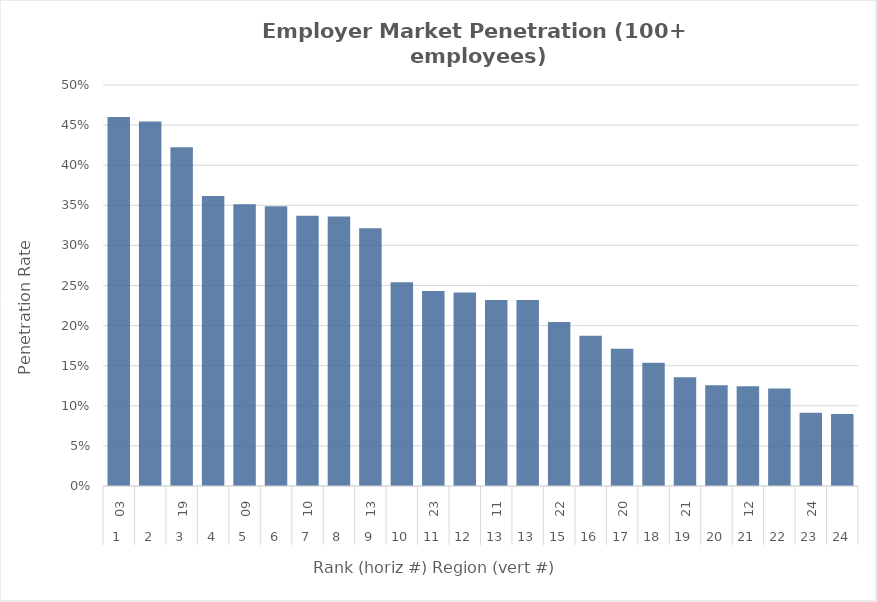
| Category | Rate |
|---|---|
| 0 | 0.46 |
| 1 | 0.455 |
| 2 | 0.423 |
| 3 | 0.362 |
| 4 | 0.351 |
| 5 | 0.349 |
| 6 | 0.337 |
| 7 | 0.336 |
| 8 | 0.321 |
| 9 | 0.254 |
| 10 | 0.243 |
| 11 | 0.241 |
| 12 | 0.232 |
| 13 | 0.232 |
| 14 | 0.204 |
| 15 | 0.188 |
| 16 | 0.171 |
| 17 | 0.154 |
| 18 | 0.136 |
| 19 | 0.126 |
| 20 | 0.124 |
| 21 | 0.122 |
| 22 | 0.091 |
| 23 | 0.09 |